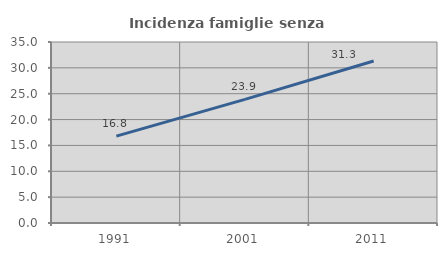
| Category | Incidenza famiglie senza nuclei |
|---|---|
| 1991.0 | 16.788 |
| 2001.0 | 23.902 |
| 2011.0 | 31.316 |